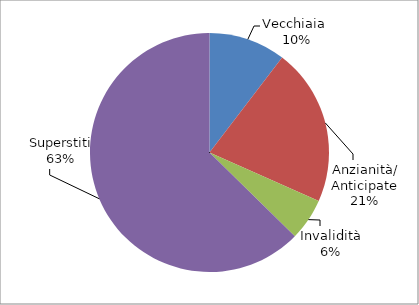
| Category | Series 0 |
|---|---|
| Vecchiaia  | 847 |
| Anzianità/ Anticipate | 1731 |
| Invalidità | 464 |
| Superstiti | 5105 |